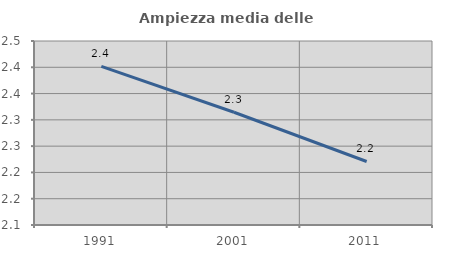
| Category | Ampiezza media delle famiglie |
|---|---|
| 1991.0 | 2.402 |
| 2001.0 | 2.315 |
| 2011.0 | 2.221 |